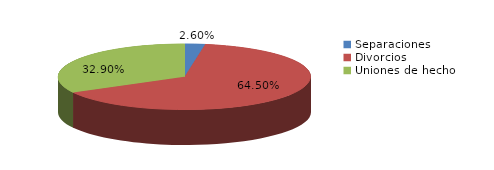
| Category | Series 0 |
|---|---|
| Separaciones | 6 |
| Divorcios | 149 |
| Uniones de hecho | 76 |